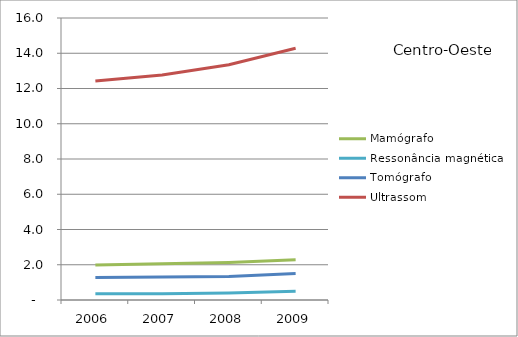
| Category | Mamógrafo | Ressonância magnética | Tomógrafo | Ultrassom |
|---|---|---|---|---|
| 2006.0 | 1.98 | 0.36 | 1.27 | 12.43 |
| 2007.0 | 2.05 | 0.36 | 1.3 | 12.76 |
| 2008.0 | 2.13 | 0.4 | 1.34 | 13.35 |
| 2009.0 | 2.28 | 0.5 | 1.5 | 14.28 |